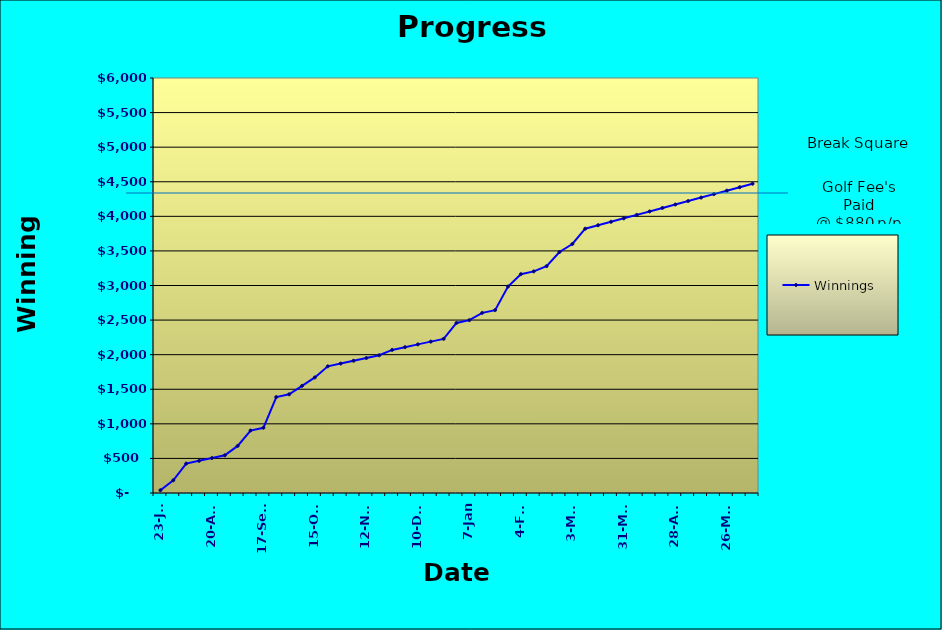
| Category | Winnings |
|---|---|
| 2011-07-23 | 40 |
| 2011-07-30 | 184 |
| 2011-08-06 | 425 |
| 2011-08-13 | 465 |
| 2011-08-20 | 505 |
| 2011-08-27 | 545 |
| 2011-09-03 | 681 |
| 2011-09-10 | 903 |
| 2011-09-17 | 943 |
| 2011-09-24 | 1387 |
| 2011-10-01 | 1427 |
| 2011-10-08 | 1549 |
| 2011-10-15 | 1671.5 |
| 2011-10-22 | 1831.5 |
| 2011-10-29 | 1871.5 |
| 2011-11-05 | 1911.5 |
| 2011-11-12 | 1951.5 |
| 2011-11-19 | 1991.5 |
| 2011-11-26 | 2068.5 |
| 2011-12-03 | 2108.5 |
| 2011-12-10 | 2148.5 |
| 2011-12-17 | 2188.5 |
| 2011-12-26 | 2228.5 |
| 2011-12-31 | 2459 |
| 2011-01-07 | 2499 |
| 2011-01-14 | 2604 |
| 2011-01-21 | 2644 |
| 2011-01-28 | 2984 |
| 2011-02-04 | 3164 |
| 2011-02-11 | 3204 |
| 2011-02-18 | 3280 |
| 2011-02-25 | 3484 |
| 2011-03-03 | 3600 |
| 2011-03-10 | 3821 |
| 2011-03-17 | 3871 |
| 2011-03-24 | 3921 |
| 2011-03-31 | 3971 |
| 2011-04-07 | 4021 |
| 2011-04-14 | 4071 |
| 2011-04-21 | 4121 |
| 2011-04-28 | 4171 |
| 2011-05-05 | 4221 |
| 2011-05-12 | 4271 |
| 2011-05-19 | 4321 |
| 2011-05-26 | 4371 |
| 2011-06-02 | 4421 |
| 2011-06-09 | 4471 |